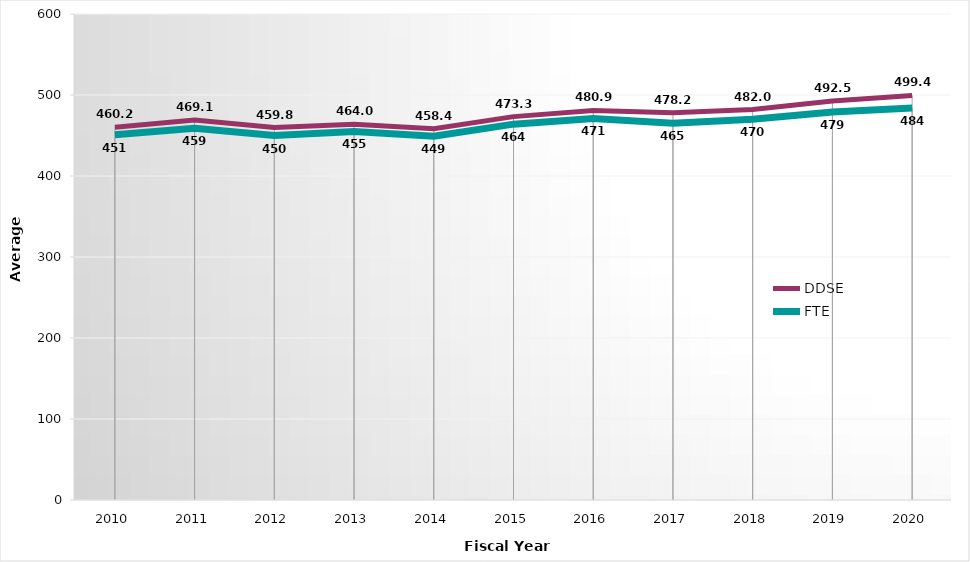
| Category | DDSE | FTE |
|---|---|---|
| 2010.0 | 460.2 | 451 |
| 2011.0 | 469.1 | 459 |
| 2012.0 | 459.8 | 450 |
| 2013.0 | 464 | 455 |
| 2014.0 | 458.4 | 449 |
| 2015.0 | 473.3 | 464 |
| 2016.0 | 480.9 | 471 |
| 2017.0 | 478.2 | 465 |
| 2018.0 | 482 | 470 |
| 2019.0 | 492.5 | 479 |
| 2020.0 | 499.4 | 484 |